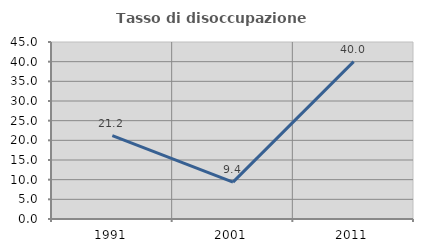
| Category | Tasso di disoccupazione giovanile  |
|---|---|
| 1991.0 | 21.212 |
| 2001.0 | 9.375 |
| 2011.0 | 40 |